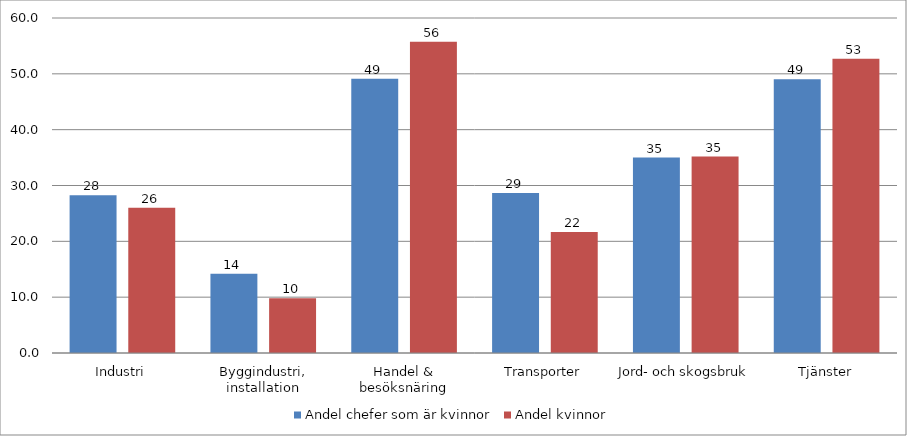
| Category | Andel chefer som är kvinnor | Andel kvinnor |
|---|---|---|
| Industri | 28.244 | 26.007 |
| Byggindustri, installation | 14.21 | 9.8 |
| Handel & besöksnäring | 49.127 | 55.766 |
| Transporter | 28.673 | 21.663 |
| Jord- och skogsbruk | 35.01 | 35.172 |
| Tjänster | 49.05 | 52.715 |